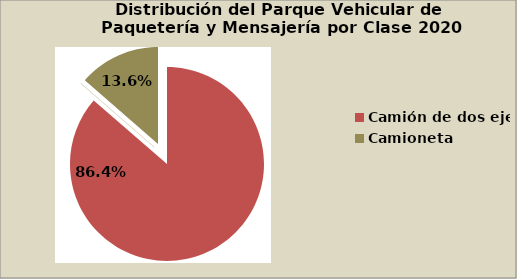
| Category | Series 0 |
|---|---|
| Camión de dos ejes | 86.367 |
| Camión de tres ejes | 0.024 |
| Camioneta | 13.609 |